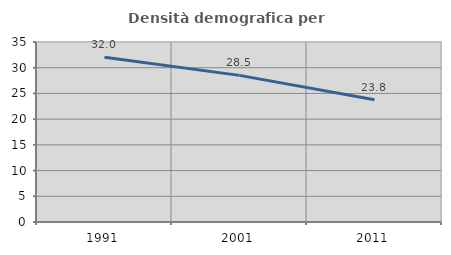
| Category | Densità demografica |
|---|---|
| 1991.0 | 32.041 |
| 2001.0 | 28.511 |
| 2011.0 | 23.759 |